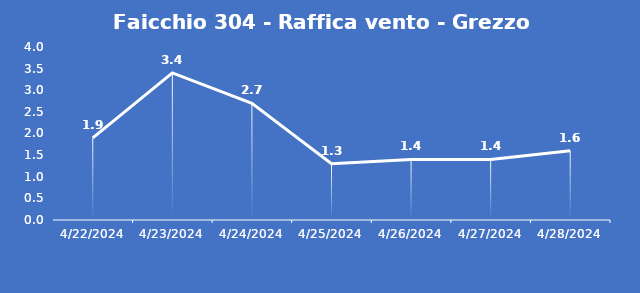
| Category | Faicchio 304 - Raffica vento - Grezzo (m/s) |
|---|---|
| 4/22/24 | 1.9 |
| 4/23/24 | 3.4 |
| 4/24/24 | 2.7 |
| 4/25/24 | 1.3 |
| 4/26/24 | 1.4 |
| 4/27/24 | 1.4 |
| 4/28/24 | 1.6 |